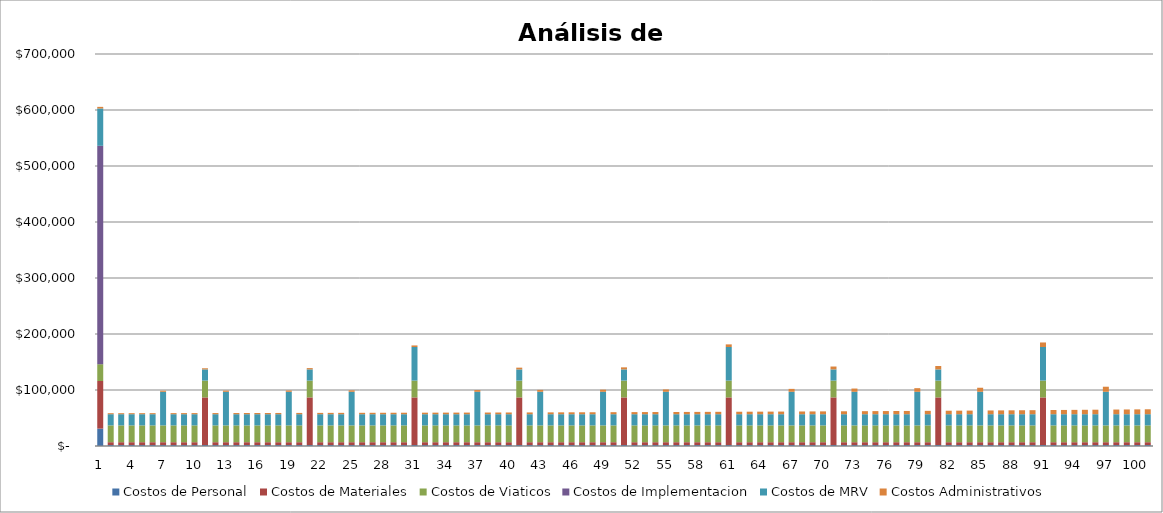
| Category | Costos de Personal | Costos de Materiales | Costos de Viaticos | Costos de Implementacion | Costos de MRV | Costos Administrativos |
|---|---|---|---|---|---|---|
| 0 | 31061.757 | 85000 | 30000 | 390000 | 66666.667 | 2860 |
| 1 | 1792.024 | 5000 | 30000 | 0 | 20000 | 1769.508 |
| 2 | 1792.024 | 5000 | 30000 | 0 | 20000 | 1792.418 |
| 3 | 1792.024 | 5000 | 30000 | 0 | 20000 | 1815.787 |
| 4 | 1792.024 | 5000 | 30000 | 0 | 20000 | 1839.622 |
| 5 | 1792.024 | 5000 | 30000 | 0 | 20000 | 1863.935 |
| 6 | 1792.024 | 5000 | 30000 | 0 | 60000 | 1900.826 |
| 7 | 1792.024 | 5000 | 30000 | 0 | 20000 | 1914.028 |
| 8 | 1792.024 | 5000 | 30000 | 0 | 20000 | 1939.829 |
| 9 | 1792.024 | 5000 | 30000 | 0 | 20000 | 1966.145 |
| 10 | 1792.024 | 85000 | 30000 | 0 | 20000 | 1992.988 |
| 11 | 1792.024 | 5000 | 30000 | 0 | 20000 | 2020.368 |
| 12 | 1792.024 | 5000 | 30000 | 0 | 60000 | 2082.993 |
| 13 | 1792.024 | 5000 | 30000 | 0 | 20000 | 2076.781 |
| 14 | 1792.024 | 5000 | 30000 | 0 | 20000 | 2105.837 |
| 15 | 1792.024 | 5000 | 30000 | 0 | 20000 | 2135.473 |
| 16 | 1792.024 | 5000 | 30000 | 0 | 20000 | 2165.703 |
| 17 | 1792.024 | 5000 | 30000 | 0 | 20000 | 2211.954 |
| 18 | 1792.024 | 5000 | 30000 | 0 | 60000 | 2303.581 |
| 19 | 1792.024 | 5000 | 30000 | 0 | 20000 | 2275.485 |
| 20 | 1792.024 | 85000 | 30000 | 0 | 20000 | 2308.206 |
| 21 | 1792.024 | 5000 | 30000 | 0 | 20000 | 2341.582 |
| 22 | 1792.024 | 5000 | 30000 | 0 | 20000 | 2375.625 |
| 23 | 1792.024 | 5000 | 30000 | 0 | 20000 | 2410.349 |
| 24 | 1792.024 | 5000 | 30000 | 0 | 60000 | 2534.837 |
| 25 | 1792.024 | 5000 | 30000 | 0 | 20000 | 2481.895 |
| 26 | 1792.024 | 5000 | 30000 | 0 | 20000 | 2518.744 |
| 27 | 1792.024 | 5000 | 30000 | 0 | 20000 | 2556.331 |
| 28 | 1792.024 | 5000 | 30000 | 0 | 20000 | 2594.669 |
| 29 | 1792.024 | 5000 | 30000 | 0 | 20000 | 2633.774 |
| 30 | 1792.024 | 85000 | 30000 | 0 | 60000 | 2795.285 |
| 31 | 1792.024 | 5000 | 30000 | 0 | 20000 | 2714.346 |
| 32 | 1792.024 | 5000 | 30000 | 0 | 20000 | 2755.845 |
| 33 | 1792.024 | 5000 | 30000 | 0 | 20000 | 2798.173 |
| 34 | 1792.024 | 5000 | 30000 | 0 | 20000 | 2841.348 |
| 35 | 1792.024 | 5000 | 30000 | 0 | 20000 | 2885.387 |
| 36 | 1792.024 | 5000 | 30000 | 0 | 60000 | 3088.557 |
| 37 | 1792.024 | 5000 | 30000 | 0 | 20000 | 2976.124 |
| 38 | 1792.024 | 5000 | 30000 | 0 | 20000 | 3022.858 |
| 39 | 1792.024 | 5000 | 30000 | 0 | 20000 | 3070.527 |
| 40 | 1792.024 | 85000 | 30000 | 0 | 20000 | 3119.149 |
| 41 | 1792.024 | 5000 | 30000 | 0 | 20000 | 3168.744 |
| 42 | 1792.024 | 5000 | 30000 | 0 | 60000 | 3418.796 |
| 43 | 1792.024 | 5000 | 30000 | 0 | 20000 | 3270.929 |
| 44 | 1792.024 | 5000 | 30000 | 0 | 20000 | 3323.559 |
| 45 | 1792.024 | 5000 | 30000 | 0 | 20000 | 3377.242 |
| 46 | 1792.024 | 5000 | 30000 | 0 | 20000 | 3431.999 |
| 47 | 1792.024 | 5000 | 30000 | 0 | 20000 | 3487.85 |
| 48 | 1792.024 | 5000 | 30000 | 0 | 60000 | 3790.665 |
| 49 | 1792.024 | 5000 | 30000 | 0 | 20000 | 3602.927 |
| 50 | 1792.024 | 85000 | 30000 | 0 | 20000 | 3662.197 |
| 51 | 1792.024 | 5000 | 30000 | 0 | 20000 | 3722.653 |
| 52 | 1792.024 | 5000 | 30000 | 0 | 20000 | 3784.317 |
| 53 | 1792.024 | 5000 | 30000 | 0 | 20000 | 3847.215 |
| 54 | 1792.024 | 5000 | 30000 | 0 | 60000 | 4209.415 |
| 55 | 1792.024 | 5000 | 30000 | 0 | 20000 | 3976.81 |
| 56 | 1792.024 | 5000 | 30000 | 0 | 20000 | 4043.558 |
| 57 | 1792.024 | 5000 | 30000 | 0 | 20000 | 4111.641 |
| 58 | 1792.024 | 5000 | 30000 | 0 | 20000 | 4181.086 |
| 59 | 1792.024 | 5000 | 30000 | 0 | 20000 | 4251.919 |
| 60 | 1792.024 | 85000 | 30000 | 0 | 60000 | 4680.961 |
| 61 | 1792.024 | 5000 | 30000 | 0 | 20000 | 4397.864 |
| 62 | 1792.024 | 5000 | 30000 | 0 | 20000 | 4473.033 |
| 63 | 1792.024 | 5000 | 30000 | 0 | 20000 | 4549.705 |
| 64 | 1792.024 | 5000 | 30000 | 0 | 20000 | 4627.911 |
| 65 | 1792.024 | 5000 | 30000 | 0 | 20000 | 4707.681 |
| 66 | 1792.024 | 5000 | 30000 | 0 | 60000 | 5211.966 |
| 67 | 1792.024 | 5000 | 30000 | 0 | 20000 | 4872.039 |
| 68 | 1792.024 | 5000 | 30000 | 0 | 20000 | 4956.691 |
| 69 | 1792.024 | 5000 | 30000 | 0 | 20000 | 5043.037 |
| 70 | 1792.024 | 85000 | 30000 | 0 | 20000 | 5131.109 |
| 71 | 1792.024 | 5000 | 30000 | 0 | 20000 | 5220.943 |
| 72 | 1792.024 | 5000 | 30000 | 0 | 60000 | 5809.928 |
| 73 | 1792.024 | 5000 | 30000 | 0 | 20000 | 5406.037 |
| 74 | 1792.024 | 5000 | 30000 | 0 | 20000 | 5501.369 |
| 75 | 1792.024 | 5000 | 30000 | 0 | 20000 | 5598.608 |
| 76 | 1792.024 | 5000 | 30000 | 0 | 20000 | 5697.792 |
| 77 | 1792.024 | 5000 | 30000 | 0 | 20000 | 5798.959 |
| 78 | 1792.024 | 5000 | 30000 | 0 | 60000 | 6483.298 |
| 79 | 1792.024 | 5000 | 30000 | 0 | 20000 | 6007.405 |
| 80 | 1792.024 | 85000 | 30000 | 0 | 20000 | 6114.765 |
| 81 | 1792.024 | 5000 | 30000 | 0 | 20000 | 6224.272 |
| 82 | 1792.024 | 5000 | 30000 | 0 | 20000 | 6335.969 |
| 83 | 1792.024 | 5000 | 30000 | 0 | 20000 | 6449.9 |
| 84 | 1792.024 | 5000 | 30000 | 0 | 60000 | 7241.587 |
| 85 | 1792.024 | 5000 | 30000 | 0 | 20000 | 6684.643 |
| 86 | 1792.024 | 5000 | 30000 | 0 | 20000 | 6805.548 |
| 87 | 1792.024 | 5000 | 30000 | 0 | 20000 | 6928.87 |
| 88 | 1792.024 | 5000 | 30000 | 0 | 20000 | 7054.659 |
| 89 | 1792.024 | 5000 | 30000 | 0 | 20000 | 7182.964 |
| 90 | 1792.024 | 85000 | 30000 | 0 | 60000 | 8095.509 |
| 91 | 1792.024 | 5000 | 30000 | 0 | 20000 | 7447.324 |
| 92 | 1792.024 | 5000 | 30000 | 0 | 20000 | 7583.482 |
| 93 | 1792.024 | 5000 | 30000 | 0 | 20000 | 7722.363 |
| 94 | 1792.024 | 5000 | 30000 | 0 | 20000 | 7864.022 |
| 95 | 1792.024 | 5000 | 30000 | 0 | 20000 | 8008.514 |
| 96 | 1792.024 | 5000 | 30000 | 0 | 60000 | 9057.131 |
| 97 | 1792.024 | 5000 | 30000 | 0 | 20000 | 8306.226 |
| 98 | 1792.024 | 5000 | 30000 | 0 | 20000 | 8459.562 |
| 99 | 1792.024 | 5000 | 30000 | 0 | 20000 | 8615.965 |
| 100 | 1792.024 | 5000 | 30000 | 0 | 20000 | 8775.496 |